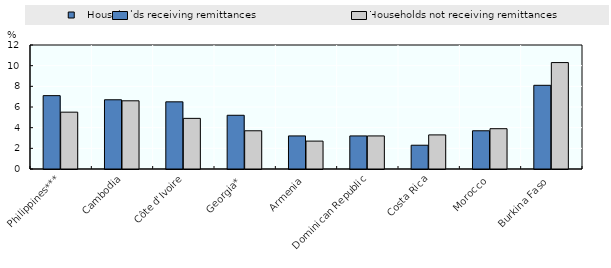
| Category |    Households receiving remittances  |   Households not receiving remittances |
|---|---|---|
| Philippines*** | 7.1 | 5.5 |
| Cambodia | 6.7 | 6.6 |
| Côte d'Ivoire | 6.5 | 4.9 |
| Georgia* | 5.2 | 3.7 |
| Armenia | 3.2 | 2.7 |
| Dominican Republic | 3.2 | 3.2 |
| Costa Rica | 2.3 | 3.3 |
| Morocco | 3.7 | 3.9 |
| Burkina Faso | 8.1 | 10.3 |